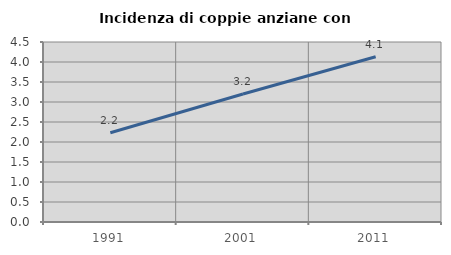
| Category | Incidenza di coppie anziane con figli |
|---|---|
| 1991.0 | 2.231 |
| 2001.0 | 3.201 |
| 2011.0 | 4.133 |